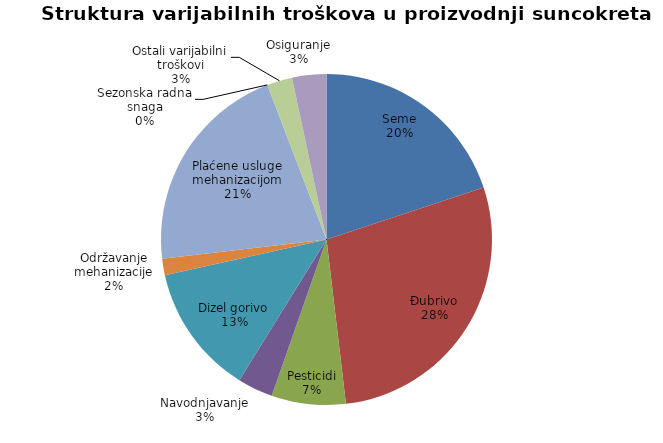
| Category | Series 0 |
|---|---|
| Seme | 12500 |
| Đubrivo | 17700 |
| Pesticidi | 4545 |
| Navodnjavanje | 2175 |
| Dizel gorivo | 7975 |
| Održavanje mehanizacije | 1009.615 |
| Plaćene usluge mehanizacijom | 13200 |
| Sezonska radna snaga | 0 |
| Ostali varijabilni troškovi | 1550 |
| Osiguranje | 2100 |